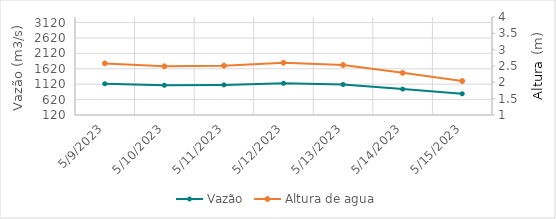
| Category | Vazão |
|---|---|
| 5/11/23 | 1091.2 |
| 5/10/23 | 1086.3 |
| 5/9/23 | 1134 |
| 5/8/23 | 1045.72 |
| 5/7/23 | 928.48 |
| 5/6/23 | 812.3 |
| 5/5/23 | 772.59 |